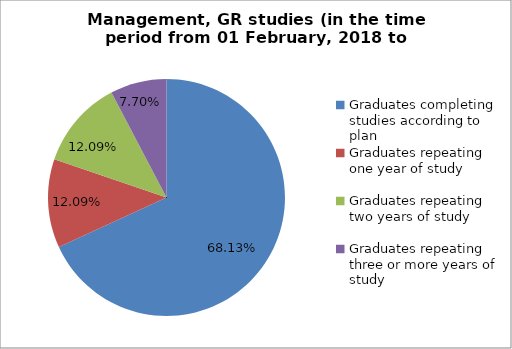
| Category | Series 0 |
|---|---|
| Graduates completing studies according to plan | 68.132 |
| Graduates repeating one year of study | 12.088 |
| Graduates repeating two years of study | 12.088 |
| Graduates repeating three or more years of study | 7.692 |